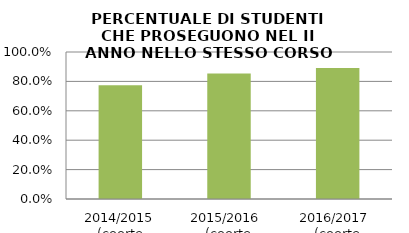
| Category | 2014/2015 (coorte 2013/14) 2015/2016  (coorte 2014/15) 2016/2017  (coorte 2015/16) |
|---|---|
| 2014/2015 (coorte 2013/14) | 0.774 |
| 2015/2016  (coorte 2014/15) | 0.853 |
| 2016/2017  (coorte 2015/16) | 0.892 |